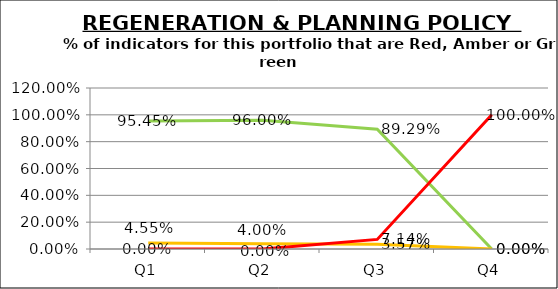
| Category | Green | Amber | Red |
|---|---|---|---|
| Q1 | 0.955 | 0.045 | 0 |
| Q2 | 0.96 | 0.04 | 0 |
| Q3 | 0.893 | 0.036 | 0.071 |
| Q4 | 0 | 0 | 1 |